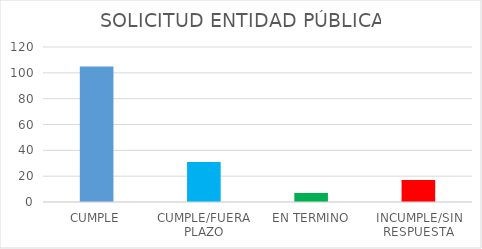
| Category | TOTAL |
|---|---|
| CUMPLE | 105 |
| CUMPLE/FUERA PLAZO | 31 |
| EN TERMINO | 7 |
| INCUMPLE/SIN RESPUESTA | 17 |